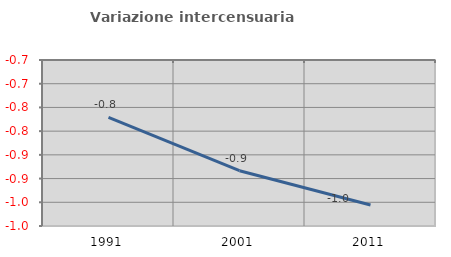
| Category | Variazione intercensuaria annua |
|---|---|
| 1991.0 | -0.771 |
| 2001.0 | -0.883 |
| 2011.0 | -0.956 |